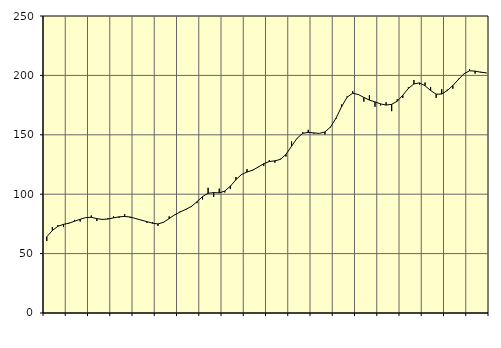
| Category | Piggar | Series 1 |
|---|---|---|
| nan | 60.6 | 64.18 |
| 1.0 | 72.3 | 69.42 |
| 1.0 | 74 | 73.02 |
| 1.0 | 72.3 | 74.6 |
| nan | 75.9 | 75.59 |
| 2.0 | 78.4 | 77.27 |
| 2.0 | 77 | 78.91 |
| 2.0 | 80.3 | 80.33 |
| nan | 82.1 | 80.56 |
| 3.0 | 77.4 | 79.43 |
| 3.0 | 78.4 | 78.78 |
| 3.0 | 79.8 | 79.09 |
| nan | 81.3 | 80.1 |
| 4.0 | 80.2 | 80.96 |
| 4.0 | 83.2 | 81.26 |
| 4.0 | 80 | 80.8 |
| nan | 79.8 | 79.49 |
| 5.0 | 78.4 | 78.16 |
| 5.0 | 75.9 | 76.92 |
| 5.0 | 76.5 | 75.58 |
| nan | 73.3 | 74.96 |
| 6.0 | 76.1 | 76.41 |
| 6.0 | 81.3 | 79.49 |
| 6.0 | 82.4 | 82.65 |
| nan | 85.7 | 85.1 |
| 7.0 | 86.8 | 87.22 |
| 7.0 | 89.2 | 89.75 |
| 7.0 | 92.5 | 93.65 |
| nan | 95.5 | 98 |
| 8.0 | 105.4 | 100.79 |
| 8.0 | 97.7 | 101.33 |
| 8.0 | 104.7 | 101.09 |
| nan | 101.5 | 102.65 |
| 9.0 | 104.3 | 106.79 |
| 9.0 | 114.5 | 112.14 |
| 9.0 | 116.1 | 116.56 |
| nan | 121.1 | 118.66 |
| 10.0 | 119.6 | 120.2 |
| 10.0 | 123.1 | 122.78 |
| 10.0 | 123.7 | 125.68 |
| nan | 128.6 | 127.49 |
| 11.0 | 126.5 | 128.08 |
| 11.0 | 129.8 | 129.3 |
| 11.0 | 131.7 | 133.56 |
| nan | 144.4 | 140.38 |
| 12.0 | 147.3 | 147.12 |
| 12.0 | 152.2 | 151.23 |
| 12.0 | 154.2 | 152.04 |
| nan | 151 | 151.6 |
| 13.0 | 151.2 | 151.21 |
| 13.0 | 150.3 | 152.41 |
| 13.0 | 156.2 | 156.51 |
| nan | 163.4 | 164.01 |
| 14.0 | 175.5 | 173.66 |
| 14.0 | 182.4 | 181.72 |
| 14.0 | 186.7 | 184.95 |
| nan | 183.7 | 183.93 |
| 15.0 | 177.9 | 181.44 |
| 15.0 | 183.3 | 179.2 |
| 15.0 | 173.6 | 177.7 |
| nan | 174.7 | 176.03 |
| 16.0 | 177.4 | 175.01 |
| 16.0 | 169.9 | 175.66 |
| 16.0 | 179.9 | 178.26 |
| nan | 181 | 183.3 |
| 17.0 | 189.9 | 189.01 |
| 17.0 | 196.1 | 192.83 |
| 17.0 | 192.2 | 193.71 |
| nan | 194 | 191.27 |
| 18.0 | 190.3 | 187.28 |
| 18.0 | 181.1 | 184.17 |
| 18.0 | 188.3 | 184.3 |
| nan | 188 | 187.29 |
| 19.0 | 188.8 | 191.48 |
| 19.0 | 197.2 | 196.51 |
| 19.0 | 201.2 | 201.35 |
| nan | 205.4 | 203.88 |
| 20.0 | 201.5 | 203.61 |
| 20.0 | 203 | 202.67 |
| 20.0 | 201.8 | 202.21 |